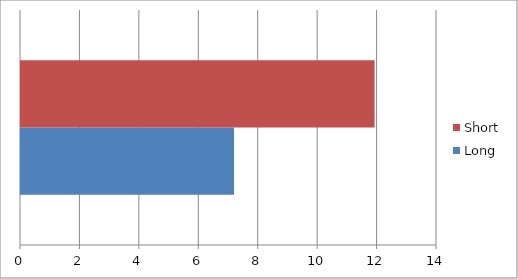
| Category | Long | Short |
|---|---|---|
| 0 | 7.17 | 11.9 |